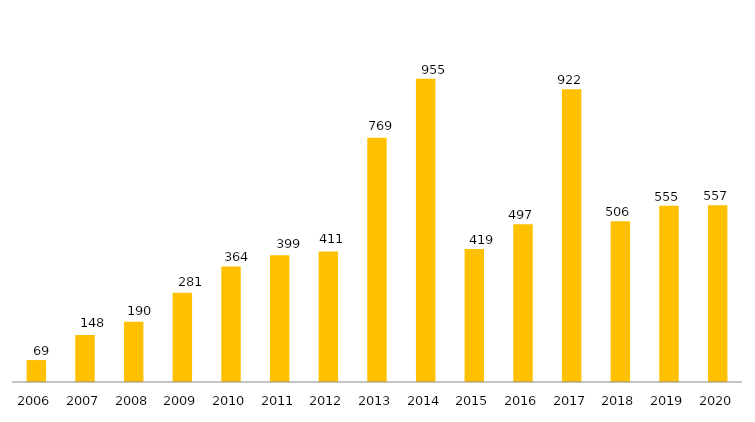
| Category | Pós - Graduação UFGD |
|---|---|
| 2006.0 | 69 |
| 2007.0 | 148 |
| 2008.0 | 190 |
| 2009.0 | 281 |
| 2010.0 | 364 |
| 2011.0 | 399 |
| 2012.0 | 411 |
| 2013.0 | 769 |
| 2014.0 | 955 |
| 2015.0 | 419 |
| 2016.0 | 497 |
| 2017.0 | 922 |
| 2018.0 | 506 |
| 2019.0 | 555 |
| 2020.0 | 557 |